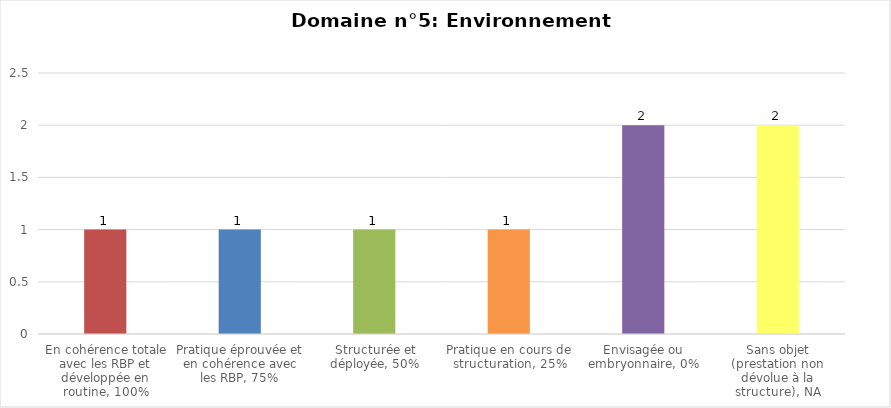
| Category | Domaine n°5: Environnement matériel |
|---|---|
| En cohérence totale avec les RBP et développée en routine, 100% | 1 |
| Pratique éprouvée et en cohérence avec les RBP, 75% | 1 |
| Structurée et déployée, 50% | 1 |
| Pratique en cours de structuration, 25% | 1 |
| Envisagée ou embryonnaire, 0% | 2 |
| Sans objet (prestation non dévolue à la structure), NA | 2 |